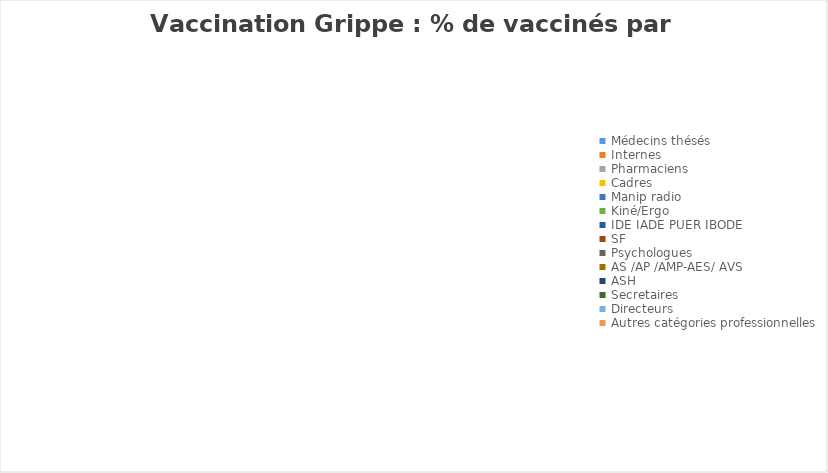
| Category | Series 0 |
|---|---|
| Médecins thésés | 0 |
| Internes | 0 |
| Pharmaciens | 0 |
| Cadres | 0 |
| Manip radio | 0 |
| Kiné/Ergo | 0 |
| IDE IADE PUER IBODE | 0 |
| SF | 0 |
| Psychologues | 0 |
| AS /AP /AMP-AES/ AVS | 0 |
| ASH | 0 |
| Secretaires | 0 |
| Directeurs | 0 |
| Autres catégories professionnelles | 0 |